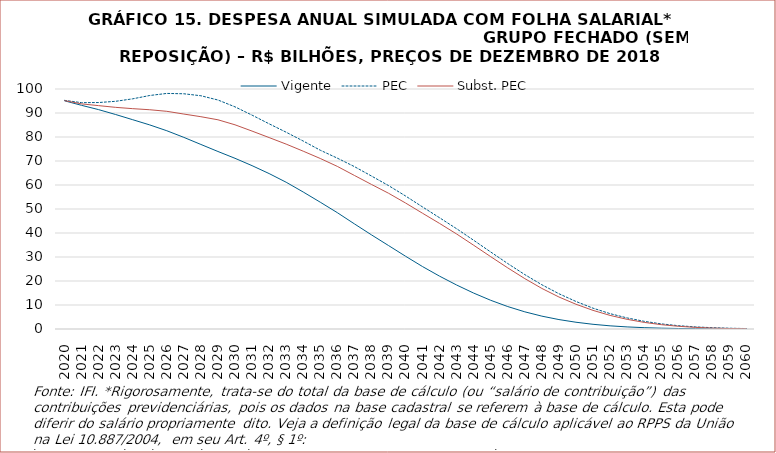
| Category | Vigente | PEC | Subst. PEC |
|---|---|---|---|
| 2020.0 | 95079891692.15 | 95270910472.403 | 95172007014.041 |
| 2021.0 | 93192632218.07 | 94304994458.309 | 93801025991.7 |
| 2022.0 | 91403525654.564 | 94359473636.632 | 93067244129.663 |
| 2023.0 | 89367576188.986 | 94875166859.791 | 92350795290.733 |
| 2024.0 | 87203610910.787 | 95907683823.473 | 91808550308.715 |
| 2025.0 | 85030090501.187 | 97294275570.578 | 91358423221.576 |
| 2026.0 | 82608426751.56 | 98156499990.643 | 90697779139.019 |
| 2027.0 | 79839268259.474 | 98009422070.178 | 89557799644.433 |
| 2028.0 | 76890399282.912 | 97185822011.462 | 88452430397.841 |
| 2029.0 | 73964731937.827 | 95410728270.788 | 87168041035.354 |
| 2030.0 | 71121973702.437 | 92564071625.219 | 85082575511.806 |
| 2031.0 | 68060783014.116 | 89107447419.533 | 82461108644.462 |
| 2032.0 | 64764455562.676 | 85499143973.646 | 79762257951.94 |
| 2033.0 | 61149463719.604 | 81991059716.694 | 77032791212.216 |
| 2034.0 | 57080986667.983 | 78317681394.991 | 74088547187.837 |
| 2035.0 | 52832876398.13 | 74497097082.362 | 71049735122.381 |
| 2036.0 | 48477571410.593 | 71193704358.556 | 67755815906.678 |
| 2037.0 | 43820163017.5 | 67677533422.187 | 63993153052.916 |
| 2038.0 | 39239382442.793 | 63754805271.163 | 60251412383.01 |
| 2039.0 | 34798116950.513 | 59779327884.396 | 56582787533.092 |
| 2040.0 | 30330392185.751 | 55429914525.906 | 52506778295.896 |
| 2041.0 | 26005488860.532 | 50855338400.542 | 48227990815.084 |
| 2042.0 | 22006138859.084 | 46343935591.807 | 43981776432.903 |
| 2043.0 | 18326001445.811 | 41769129036.794 | 39582778685.69 |
| 2044.0 | 14956918366.939 | 36962038767.503 | 34893035970.108 |
| 2045.0 | 11955410230.463 | 32081581980.49 | 30129471680.023 |
| 2046.0 | 9346120357.09 | 27259090508.004 | 25452337059.144 |
| 2047.0 | 7148969288.617 | 22655014828.34 | 20985309896.334 |
| 2048.0 | 5355298352.675 | 18430707381.673 | 16897603961.582 |
| 2049.0 | 3927930741.789 | 14694477348.589 | 13332442233.858 |
| 2050.0 | 2814609829.702 | 11471180852.494 | 10310905418.192 |
| 2051.0 | 1955916608.046 | 8670753550.907 | 7755574532.046 |
| 2052.0 | 1318880048.509 | 6395593078.35 | 5670288203.12 |
| 2053.0 | 868415693.258 | 4613068960.069 | 4025079192.912 |
| 2054.0 | 553634207.209 | 3196173716.729 | 2754461675.434 |
| 2055.0 | 347405149.796 | 2136261585.108 | 1809620166.984 |
| 2056.0 | 213091232.393 | 1382910498.512 | 1133994189.019 |
| 2057.0 | 125180086.31 | 876468374.574 | 676426431.193 |
| 2058.0 | 73123873.281 | 540242803.445 | 375584421.17 |
| 2059.0 | 42756524.819 | 320925339.168 | 193373520.446 |
| 2060.0 | 24718894.611 | 186141625.195 | 92936516.786 |